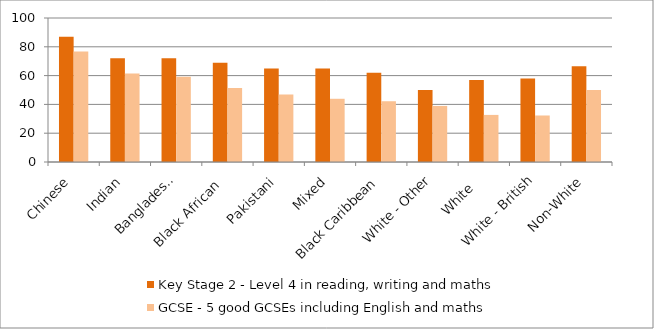
| Category | Key Stage 2 - Level 4 in reading, writing and maths | GCSE - 5 good GCSEs including English and maths |
|---|---|---|
| Chinese | 87 | 76.8 |
| Indian | 72 | 61.5 |
| Bangladeshi | 72 | 59.2 |
| Black African  | 69 | 51.4 |
| Pakistani | 65 | 46.8 |
| Mixed | 65 | 43.9 |
| Black Caribbean | 62 | 42.2 |
| White - Other | 50 | 38.928 |
| White   | 57 | 32.7 |
| White - British | 58 | 32.3 |
| Non-White | 66.414 | 50 |